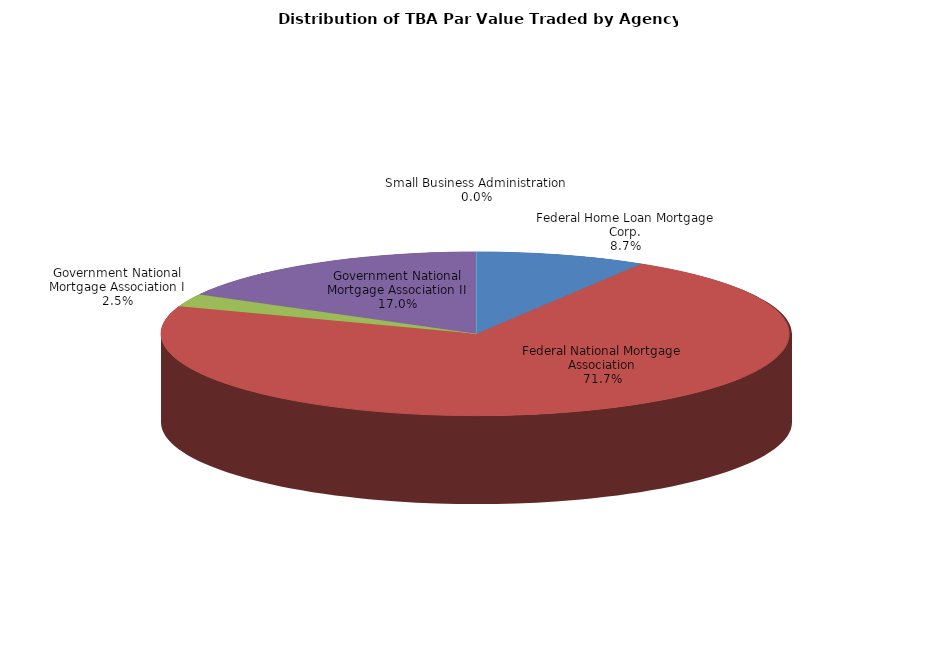
| Category | Series 0 |
|---|---|
| Federal Home Loan Mortgage Corp. | 15688759493.404 |
| Federal National Mortgage Association | 128979974759.071 |
| Government National Mortgage Association I | 4533679758.869 |
| Government National Mortgage Association II | 30584040241.52 |
| Small Business Administration | 9218647.445 |